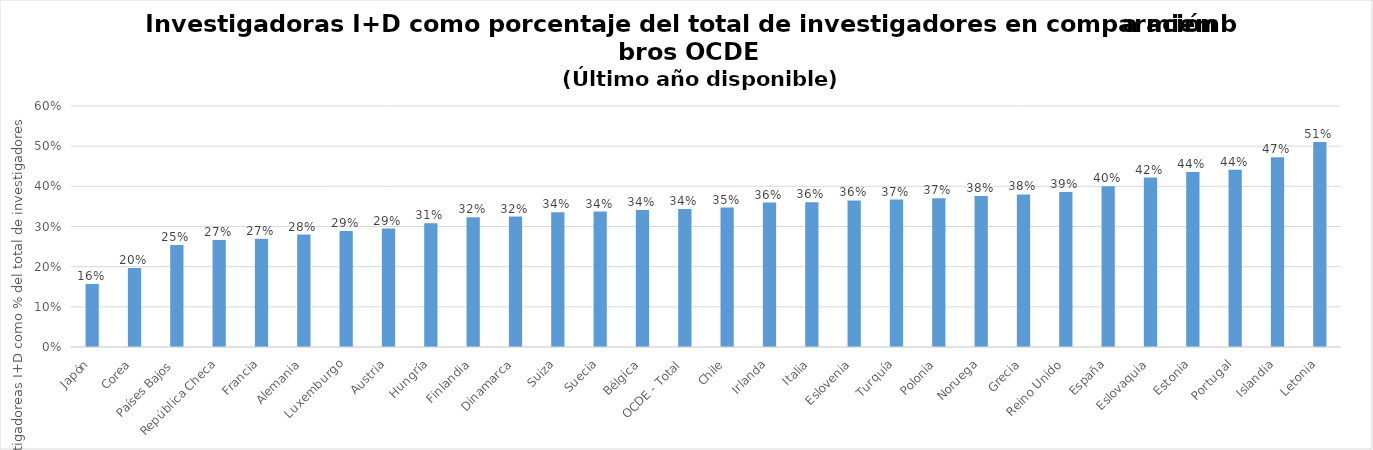
| Category | Investigadoras I+D como porcentaje del total |
|---|---|
| Japón | 0.157 |
| Corea | 0.197 |
| Países Bajos | 0.254 |
| República Checa | 0.267 |
| Francia | 0.27 |
| Alemania | 0.28 |
| Luxemburgo | 0.289 |
| Austria | 0.295 |
| Hungría | 0.308 |
| Finlandia | 0.323 |
| Dinamarca | 0.325 |
| Suiza | 0.335 |
| Suecia | 0.337 |
| Bélgica | 0.341 |
| OCDE - Total | 0.344 |
| Chile | 0.347 |
| Irlanda | 0.359 |
| Italia | 0.36 |
| Eslovenia | 0.365 |
| Turquía | 0.367 |
| Polonia | 0.37 |
| Noruega | 0.376 |
| Grecia | 0.38 |
| Reino Unido | 0.386 |
| España | 0.4 |
| Eslovaquia | 0.422 |
| Estonia | 0.436 |
| Portugal | 0.441 |
| Islandia | 0.472 |
| Letonia | 0.51 |